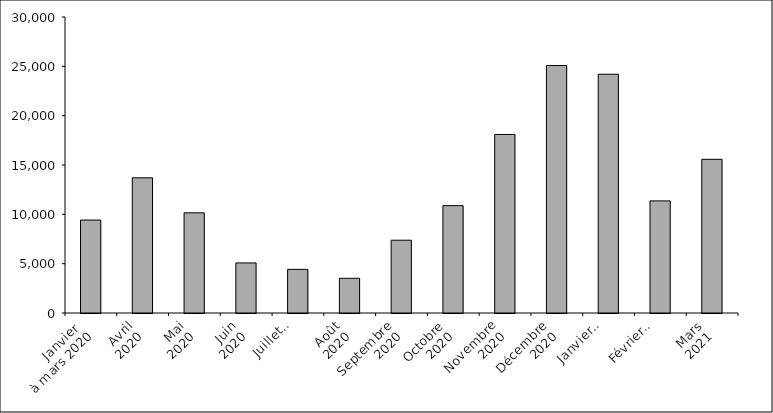
| Category | Series 0 |
|---|---|
| Janvier 
à mars 2020 | 9420 |
| Avril
2020 | 13702 |
| Mai
2020 | 10151 |
| Juin
2020 | 5074 |
| Juillet
2020 | 4423 |
| Août
2020 | 3518 |
| Septembre
2020 | 7377 |
| Octobre
2020 | 10881 |
| Novembre
2020 | 18095 |
| Décembre
2020 | 25086 |
| Janvier
2021 | 24200 |
| Février
2021 | 11361 |
| Mars
2021 | 15575 |